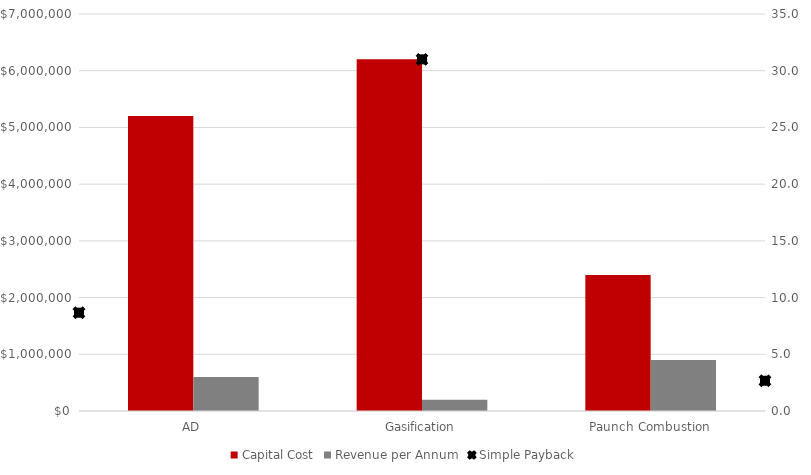
| Category | Capital Cost | Revenue per Annum |
|---|---|---|
| AD | 5200000 | 600000 |
| Gasification | 6200000 | 200000 |
| Paunch Combustion | 2400000 | 900000 |